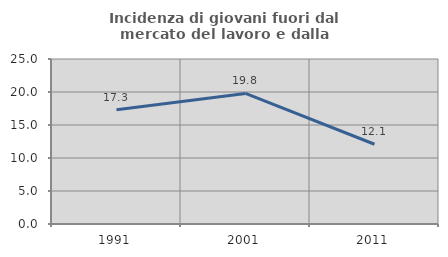
| Category | Incidenza di giovani fuori dal mercato del lavoro e dalla formazione  |
|---|---|
| 1991.0 | 17.302 |
| 2001.0 | 19.787 |
| 2011.0 | 12.085 |